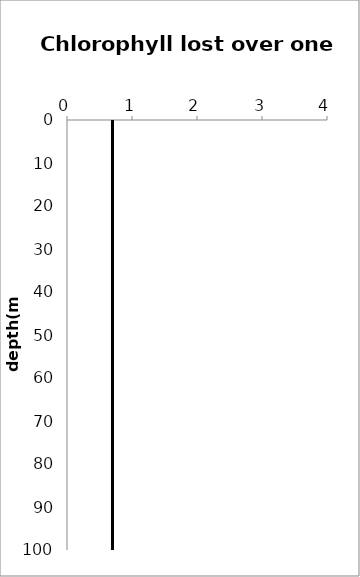
| Category | Profile 2 |
|---|---|
| 0.6997176151520064 | 0 |
| 0.6997176151520064 | 5 |
| 0.6997176151520064 | 10 |
| 0.6997176151520064 | 15 |
| 0.6997176151520064 | 20 |
| 0.6997176151520064 | 25 |
| 0.6997176151520064 | 30 |
| 0.6997176151520064 | 35 |
| 0.6997176151520064 | 40 |
| 0.6997176151520064 | 45 |
| 0.6997176151520064 | 50 |
| 0.6997176151520064 | 55 |
| 0.6997176151520064 | 60 |
| 0.6997176151520064 | 65 |
| 0.6997176151520064 | 70 |
| 0.6997176151520064 | 75 |
| 0.6997176151520064 | 80 |
| 0.6997176151520064 | 85 |
| 0.6997176151520064 | 90 |
| 0.6997176151520064 | 95 |
| 0.6997176151520064 | 100 |